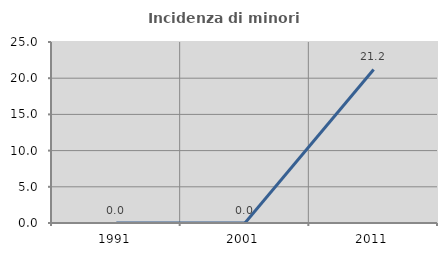
| Category | Incidenza di minori stranieri |
|---|---|
| 1991.0 | 0 |
| 2001.0 | 0 |
| 2011.0 | 21.212 |